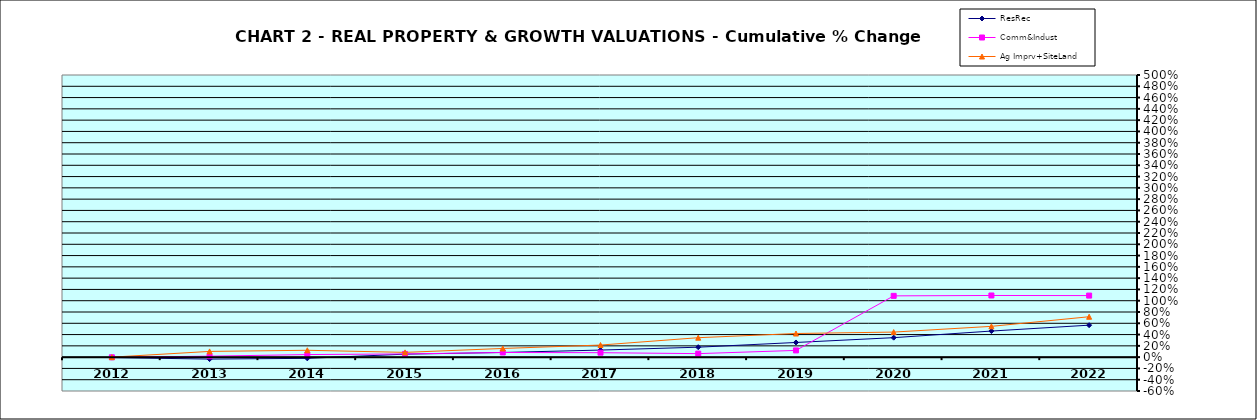
| Category | ResRec | Comm&Indust | Ag Imprv+SiteLand |
|---|---|---|---|
| 2012.0 | -0.008 | -0.002 | 0 |
| 2013.0 | -0.035 | 0.017 | 0.102 |
| 2014.0 | -0.021 | 0.046 | 0.122 |
| 2015.0 | 0.053 | 0.057 | 0.084 |
| 2016.0 | 0.083 | 0.082 | 0.154 |
| 2017.0 | 0.125 | 0.079 | 0.214 |
| 2018.0 | 0.176 | 0.062 | 0.345 |
| 2019.0 | 0.26 | 0.119 | 0.419 |
| 2020.0 | 0.345 | 1.086 | 0.444 |
| 2021.0 | 0.462 | 1.093 | 0.546 |
| 2022.0 | 0.567 | 1.091 | 0.716 |